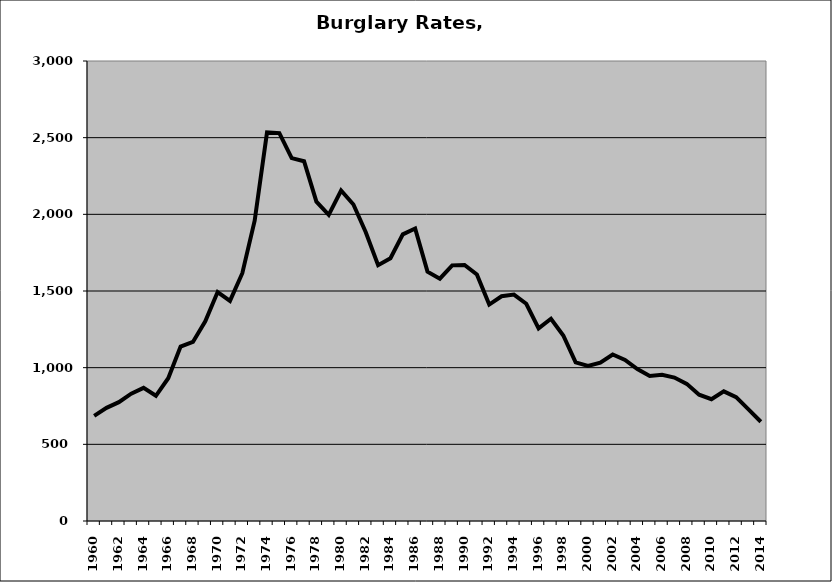
| Category | Burglary |
|---|---|
| 1960.0 | 685.476 |
| 1961.0 | 737.743 |
| 1962.0 | 774.884 |
| 1963.0 | 830.276 |
| 1964.0 | 868.185 |
| 1965.0 | 816.48 |
| 1966.0 | 931.15 |
| 1967.0 | 1137.271 |
| 1968.0 | 1167.425 |
| 1969.0 | 1302.599 |
| 1970.0 | 1493.048 |
| 1971.0 | 1435.857 |
| 1972.0 | 1615.887 |
| 1973.0 | 1958.26 |
| 1974.0 | 2533.999 |
| 1975.0 | 2529.901 |
| 1976.0 | 2366.608 |
| 1977.0 | 2346.08 |
| 1978.0 | 2082.54 |
| 1979.0 | 1996.571 |
| 1980.0 | 2155.407 |
| 1981.0 | 2064.268 |
| 1982.0 | 1883.252 |
| 1983.0 | 1668.579 |
| 1984.0 | 1713.953 |
| 1985.0 | 1869.627 |
| 1986.0 | 1907.688 |
| 1987.0 | 1626.078 |
| 1988.0 | 1580.294 |
| 1989.0 | 1667.154 |
| 1990.0 | 1669.91 |
| 1991.0 | 1607.493 |
| 1992.0 | 1411.665 |
| 1993.0 | 1465.549 |
| 1994.0 | 1476.245 |
| 1995.0 | 1416.833 |
| 1996.0 | 1256.323 |
| 1997.0 | 1318.924 |
| 1998.0 | 1209.531 |
| 1999.0 | 1034.315 |
| 2000.0 | 1011.61 |
| 2001.0 | 1033.001 |
| 2002.0 | 1085.934 |
| 2003.0 | 1050.559 |
| 2004.0 | 991.049 |
| 2005.0 | 946.211 |
| 2006.0 | 953.048 |
| 2007.0 | 935.357 |
| 2008.0 | 894.316 |
| 2009.0 | 823.375 |
| 2010.0 | 794.288 |
| 2011.0 | 845.714 |
| 2012.0 | 807.66 |
| 2013.0 | 727.838 |
| 2014.0 | 647.138 |